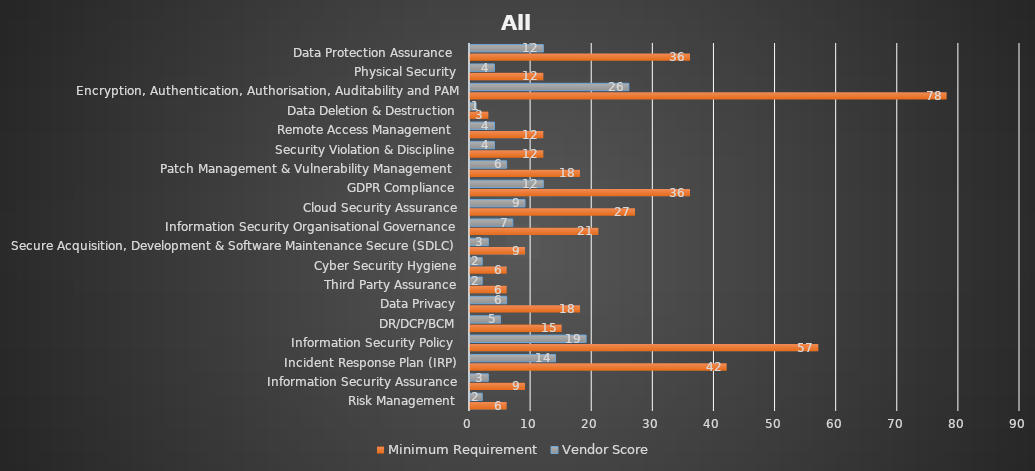
| Category | Minimum Requirement | Vendor Score |
|---|---|---|
| Risk Management | 6 | 2 |
| Information Security Assurance | 9 | 3 |
| Incident Response Plan (IRP) | 42 | 14 |
| Information Security Policy  | 57 | 19 |
| DR/DCP/BCM | 15 | 5 |
| Data Privacy | 18 | 6 |
| Third Party Assurance | 6 | 2 |
| Cyber Security Hygiene | 6 | 2 |
| Secure Acquisition, Development & Software Maintenance Secure (SDLC)  | 9 | 3 |
| Information Security Organisational Governance | 21 | 7 |
| Cloud Security Assurance | 27 | 9 |
| GDPR Compliance | 36 | 12 |
| Patch Management & Vulnerability Management  | 18 | 6 |
| Security Violation & Discipline | 12 | 4 |
| Remote Access Management  | 12 | 4 |
| Data Deletion & Destruction | 3 | 1 |
| Encryption, Authentication, Authorisation, Auditability and PAM | 78 | 26 |
| Physical Security | 12 | 4 |
| Data Protection Assurance  | 36 | 12 |